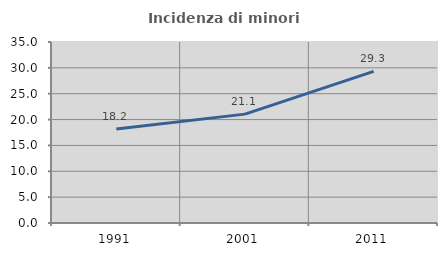
| Category | Incidenza di minori stranieri |
|---|---|
| 1991.0 | 18.182 |
| 2001.0 | 21.053 |
| 2011.0 | 29.31 |